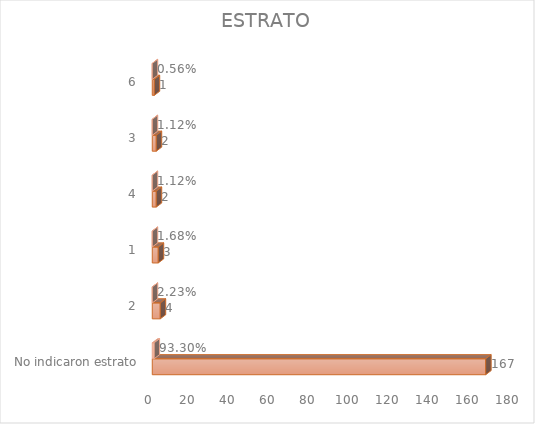
| Category | Cuenta de Número petición | Cuenta de Número petición2 |
|---|---|---|
| No indicaron estrato | 167 | 0.933 |
| 2 | 4 | 0.022 |
| 1 | 3 | 0.017 |
| 4 | 2 | 0.011 |
| 3 | 2 | 0.011 |
| 6 | 1 | 0.006 |